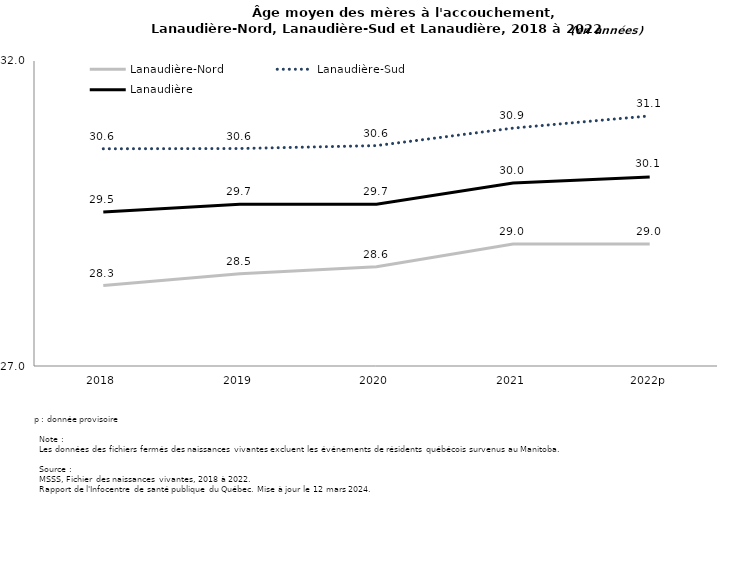
| Category | Lanaudière-Nord | Lanaudière-Sud | Lanaudière |
|---|---|---|---|
| 2018 | 28.319 | 30.561 | 29.527 |
| 2019 | 28.514 | 30.565 | 29.653 |
| 2020 | 28.626 | 30.613 | 29.653 |
| 2021 | 29 | 30.9 | 30 |
| 2022p | 29 | 31.1 | 30.1 |